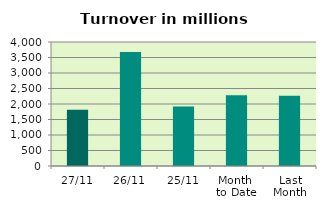
| Category | Series 0 |
|---|---|
| 27/11 | 1812.374 |
| 26/11 | 3679.944 |
| 25/11 | 1918.471 |
| Month 
to Date | 2286.135 |
| Last
Month | 2263.558 |